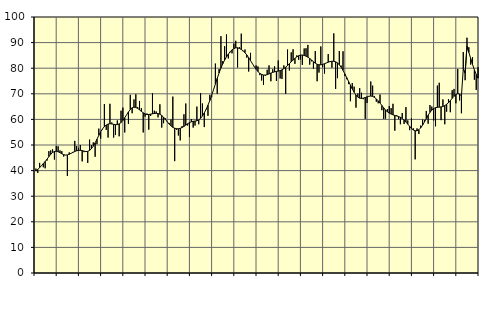
| Category | Piggar | Series 1 |
|---|---|---|
| nan | 40.8 | 39.8 |
| 1.0 | 39.1 | 40.43 |
| 1.0 | 43 | 41.18 |
| 1.0 | 42 | 41.94 |
| 1.0 | 41.3 | 42.73 |
| 1.0 | 40.9 | 43.58 |
| 1.0 | 43.9 | 44.46 |
| 1.0 | 47.6 | 45.46 |
| 1.0 | 47.9 | 46.36 |
| 1.0 | 48.3 | 47.07 |
| 1.0 | 44.3 | 47.47 |
| 1.0 | 49.6 | 47.55 |
| nan | 49.5 | 47.36 |
| 2.0 | 47.9 | 46.98 |
| 2.0 | 47.6 | 46.57 |
| 2.0 | 45.5 | 46.23 |
| 2.0 | 46.1 | 46.06 |
| 2.0 | 37.9 | 46.13 |
| 2.0 | 47.1 | 46.39 |
| 2.0 | 46.7 | 46.74 |
| 2.0 | 47.3 | 47.11 |
| 2.0 | 51.6 | 47.46 |
| 2.0 | 49.6 | 47.75 |
| 2.0 | 48.9 | 47.91 |
| nan | 50 | 47.91 |
| 3.0 | 43.6 | 47.8 |
| 3.0 | 47.2 | 47.6 |
| 3.0 | 47.3 | 47.45 |
| 3.0 | 43 | 47.52 |
| 3.0 | 52.1 | 47.88 |
| 3.0 | 50 | 48.56 |
| 3.0 | 51 | 49.56 |
| 3.0 | 45.4 | 50.84 |
| 3.0 | 50.3 | 52.28 |
| 3.0 | 56.4 | 53.76 |
| 3.0 | 52.5 | 55.15 |
| nan | 56.1 | 56.3 |
| 4.0 | 66 | 57.19 |
| 4.0 | 55.9 | 57.81 |
| 4.0 | 52.9 | 58.18 |
| 4.0 | 66.1 | 58.29 |
| 4.0 | 58.8 | 58.23 |
| 4.0 | 52.9 | 58.07 |
| 4.0 | 53.9 | 57.94 |
| 4.0 | 59.6 | 57.97 |
| 4.0 | 53.4 | 58.24 |
| 4.0 | 63.4 | 58.77 |
| 4.0 | 64.6 | 59.59 |
| nan | 54.9 | 60.64 |
| 5.0 | 61.8 | 61.79 |
| 5.0 | 58.3 | 62.9 |
| 5.0 | 69.6 | 63.88 |
| 5.0 | 62.4 | 64.54 |
| 5.0 | 67.8 | 64.78 |
| 5.0 | 69.8 | 64.66 |
| 5.0 | 64.8 | 64.3 |
| 5.0 | 67.2 | 63.74 |
| 5.0 | 64.4 | 63.13 |
| 5.0 | 54.9 | 62.58 |
| 5.0 | 61.1 | 62.15 |
| nan | 62.3 | 61.92 |
| 6.0 | 56 | 61.92 |
| 6.0 | 61.4 | 62.06 |
| 6.0 | 70.2 | 62.2 |
| 6.0 | 63.4 | 62.32 |
| 6.0 | 63.1 | 62.38 |
| 6.0 | 60.8 | 62.29 |
| 6.0 | 65.9 | 62.02 |
| 6.0 | 56.8 | 61.55 |
| 6.0 | 58.5 | 60.86 |
| 6.0 | 60.4 | 60 |
| 6.0 | 59.2 | 59.07 |
| nan | 58.6 | 58.19 |
| 7.0 | 59.9 | 57.45 |
| 7.0 | 68.9 | 56.9 |
| 7.0 | 43.7 | 56.55 |
| 7.0 | 55.9 | 56.36 |
| 7.0 | 53.7 | 56.35 |
| 7.0 | 51.8 | 56.53 |
| 7.0 | 57.4 | 56.83 |
| 7.0 | 62 | 57.25 |
| 7.0 | 66.2 | 57.76 |
| 7.0 | 57.6 | 58.28 |
| 7.0 | 53.1 | 58.73 |
| nan | 60.1 | 59.06 |
| 8.0 | 56.8 | 59.26 |
| 8.0 | 57.6 | 59.34 |
| 8.0 | 65 | 59.46 |
| 8.0 | 58.1 | 59.8 |
| 8.0 | 70.3 | 60.41 |
| 8.0 | 66.2 | 61.32 |
| 8.0 | 57 | 62.53 |
| 8.0 | 63.8 | 63.95 |
| 8.0 | 61.4 | 65.57 |
| 8.0 | 69.6 | 67.38 |
| 8.0 | 68.7 | 69.41 |
| nan | 71.5 | 71.59 |
| 9.0 | 81.8 | 73.81 |
| 9.0 | 70 | 76.02 |
| 9.0 | 79.7 | 78.13 |
| 9.0 | 92.5 | 80.04 |
| 9.0 | 82.8 | 81.72 |
| 9.0 | 88.6 | 83.17 |
| 9.0 | 93.2 | 84.4 |
| 9.0 | 83.8 | 85.49 |
| 9.0 | 86.2 | 86.43 |
| 9.0 | 85.8 | 87.17 |
| 9.0 | 89.6 | 87.69 |
| nan | 90.7 | 87.96 |
| 10.0 | 80.3 | 87.97 |
| 10.0 | 88.2 | 87.73 |
| 10.0 | 93.5 | 87.32 |
| 10.0 | 86.6 | 86.76 |
| 10.0 | 87.3 | 86.05 |
| 10.0 | 84.1 | 85.17 |
| 10.0 | 78.7 | 84.13 |
| 10.0 | 86 | 82.97 |
| 10.0 | 81.7 | 81.8 |
| 10.0 | 80.5 | 80.64 |
| 10.0 | 81.1 | 79.6 |
| nan | 80.7 | 78.71 |
| 11.0 | 77.3 | 78.02 |
| 11.0 | 75.2 | 77.58 |
| 11.0 | 73.5 | 77.34 |
| 11.0 | 77 | 77.32 |
| 11.0 | 79.4 | 77.48 |
| 11.0 | 81.1 | 77.76 |
| 11.0 | 74.9 | 78.09 |
| 11.0 | 79.6 | 78.38 |
| 11.0 | 80.7 | 78.58 |
| 11.0 | 75 | 78.73 |
| 11.0 | 83 | 78.87 |
| nan | 76 | 79.05 |
| 12.0 | 75.8 | 79.36 |
| 12.0 | 81.1 | 79.81 |
| 12.0 | 70 | 80.4 |
| 12.0 | 87.3 | 81.06 |
| 12.0 | 79.1 | 81.75 |
| 12.0 | 86.2 | 82.46 |
| 12.0 | 87.4 | 83.18 |
| 12.0 | 81.7 | 83.84 |
| 12.0 | 85 | 84.42 |
| 12.0 | 83.3 | 84.87 |
| 12.0 | 83.4 | 85.13 |
| nan | 81.3 | 85.15 |
| 13.0 | 87.7 | 85 |
| 13.0 | 87.8 | 84.71 |
| 13.0 | 89.1 | 84.31 |
| 13.0 | 81.4 | 83.8 |
| 13.0 | 82.7 | 83.21 |
| 13.0 | 79.8 | 82.55 |
| 13.0 | 86.7 | 81.95 |
| 13.0 | 74.9 | 81.53 |
| 13.0 | 78.3 | 81.33 |
| 13.0 | 88.5 | 81.34 |
| 13.0 | 80.4 | 81.49 |
| nan | 77.9 | 81.76 |
| 14.0 | 82 | 82.06 |
| 14.0 | 85.5 | 82.34 |
| 14.0 | 82.8 | 82.57 |
| 14.0 | 80.2 | 82.71 |
| 14.0 | 93.6 | 82.7 |
| 14.0 | 71.9 | 82.5 |
| 14.0 | 76.1 | 82.07 |
| 14.0 | 86.7 | 81.36 |
| 14.0 | 81 | 80.39 |
| 14.0 | 86.6 | 79.15 |
| 14.0 | 76.9 | 77.75 |
| nan | 75.7 | 76.3 |
| 15.0 | 73.8 | 74.84 |
| 15.0 | 67.1 | 73.37 |
| 15.0 | 74.2 | 71.92 |
| 15.0 | 72.8 | 70.59 |
| 15.0 | 64.6 | 69.5 |
| 15.0 | 70.1 | 68.71 |
| 15.0 | 72.2 | 68.31 |
| 15.0 | 70.4 | 68.2 |
| 15.0 | 67.9 | 68.3 |
| 15.0 | 60.2 | 68.55 |
| 15.0 | 66.4 | 68.82 |
| nan | 69.1 | 69.05 |
| 16.0 | 74.8 | 69.12 |
| 16.0 | 73.2 | 68.98 |
| 16.0 | 69.1 | 68.61 |
| 16.0 | 66.9 | 68.01 |
| 16.0 | 66.3 | 67.25 |
| 16.0 | 69.7 | 66.38 |
| 16.0 | 63.6 | 65.43 |
| 16.0 | 60.2 | 64.5 |
| 16.0 | 60.3 | 63.65 |
| 16.0 | 64 | 62.96 |
| 16.0 | 65.2 | 62.46 |
| nan | 64.4 | 62.09 |
| 17.0 | 66.1 | 61.78 |
| 17.0 | 55.6 | 61.54 |
| 17.0 | 61.6 | 61.34 |
| 17.0 | 60.1 | 61.13 |
| 17.0 | 58.1 | 60.82 |
| 17.0 | 62.5 | 60.36 |
| 17.0 | 58.2 | 59.73 |
| 17.0 | 64.8 | 58.97 |
| 17.0 | 59.6 | 58.14 |
| 17.0 | 55.8 | 57.29 |
| 17.0 | 60.4 | 56.48 |
| nan | 56.5 | 55.85 |
| 18.0 | 44.4 | 55.53 |
| 18.0 | 56.5 | 55.58 |
| 18.0 | 54.3 | 55.98 |
| 18.0 | 57.6 | 56.71 |
| 18.0 | 59.9 | 57.72 |
| 18.0 | 59.7 | 58.97 |
| 18.0 | 63.3 | 60.32 |
| 18.0 | 58.3 | 61.62 |
| 18.0 | 65.6 | 62.76 |
| 18.0 | 65 | 63.64 |
| 18.0 | 59.6 | 64.23 |
| nan | 57.3 | 64.56 |
| 19.0 | 73.2 | 64.71 |
| 19.0 | 74.3 | 64.78 |
| 19.0 | 59.7 | 64.88 |
| 19.0 | 67.8 | 65.06 |
| 19.0 | 58.1 | 65.39 |
| 19.0 | 63 | 65.89 |
| 19.0 | 67.9 | 66.55 |
| 19.0 | 62.8 | 67.35 |
| 19.0 | 71.4 | 68.22 |
| 19.0 | 71.9 | 69.04 |
| 19.0 | 66.3 | 69.72 |
| nan | 79.7 | 70.07 |
| 20.0 | 67.4 | 69.92 |
| 20.0 | 62.4 | 69.12 |
| 20.0 | 86.3 | 79.84 |
| 20.0 | 75.3 | 77.97 |
| 20.0 | 91.9 | 88.64 |
| 20.0 | 88.2 | 86.24 |
| 20.0 | 81.4 | 83.81 |
| 20.0 | 84.3 | 81.48 |
| 20.0 | 75.5 | 79.38 |
| 20.0 | 71.5 | 77.56 |
| 20.0 | 80.4 | 76.09 |